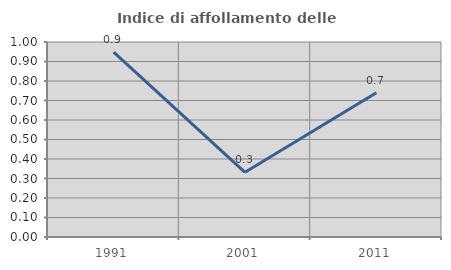
| Category | Indice di affollamento delle abitazioni  |
|---|---|
| 1991.0 | 0.948 |
| 2001.0 | 0.332 |
| 2011.0 | 0.74 |